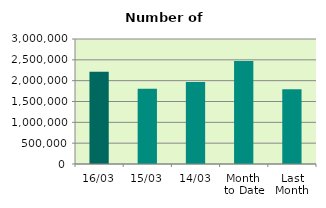
| Category | Series 0 |
|---|---|
| 16/03 | 2212964 |
| 15/03 | 1805748 |
| 14/03 | 1966250 |
| Month 
to Date | 2472679.333 |
| Last
Month | 1795830.8 |